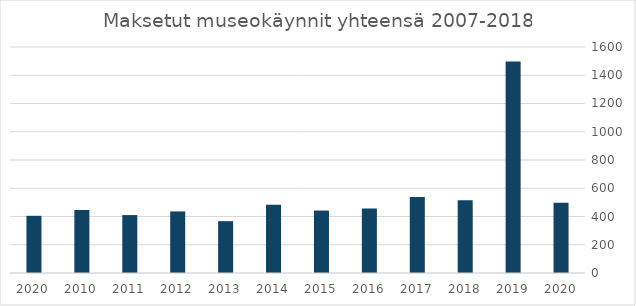
| Category | Maksetut käynnit yhteensä |
|---|---|
| 2020.0 | 498 |
| 2019.0 | 1498 |
| 2018.0 | 515 |
| 2017.0 | 538 |
| 2016.0 | 457 |
| 2015.0 | 442 |
| 2014.0 | 483 |
| 2013.0 | 367 |
| 2012.0 | 436 |
| 2011.0 | 410 |
| 2010.0 | 446 |
| 2020.0 | 405 |